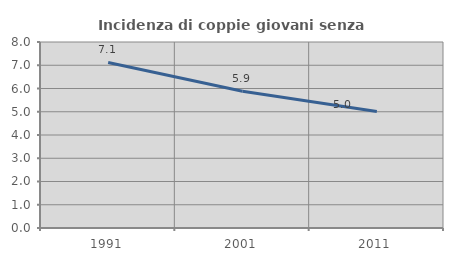
| Category | Incidenza di coppie giovani senza figli |
|---|---|
| 1991.0 | 7.12 |
| 2001.0 | 5.882 |
| 2011.0 | 5.012 |